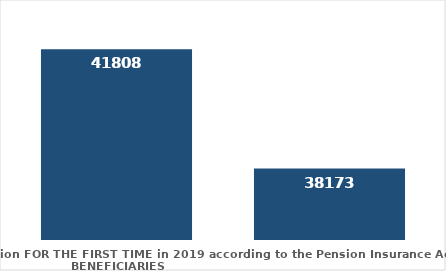
| Category | broj korisnika |
|---|---|
| Pension beneficiaries entitled to pension FOR THE FIRST TIME in 2019 according to the Pension Insurance Act  - NEW BENEFICIARIES | 41808 |
| Pension beneficiaries whose pension entitlement ceased in 2019  -  death caused,   
and who were retired according to the Pension Insurance Act   | 38173 |